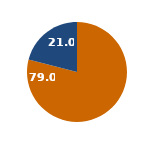
| Category | 2023 |
|---|---|
| Italia | 79 |
| Estero | 21 |